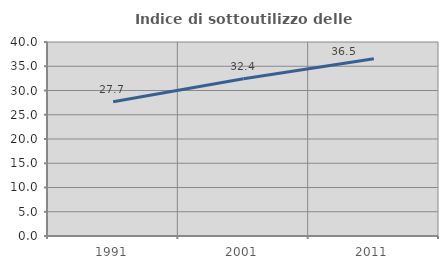
| Category | Indice di sottoutilizzo delle abitazioni  |
|---|---|
| 1991.0 | 27.674 |
| 2001.0 | 32.427 |
| 2011.0 | 36.538 |